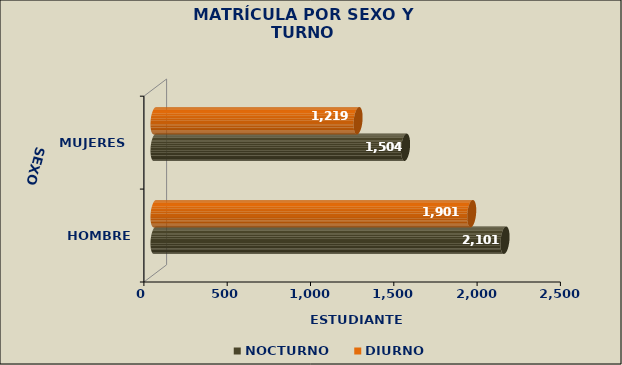
| Category | NOCTURNO | DIURNO |
|---|---|---|
| HOMBRES | 2101 | 1901 |
| MUJERES | 1504 | 1219 |